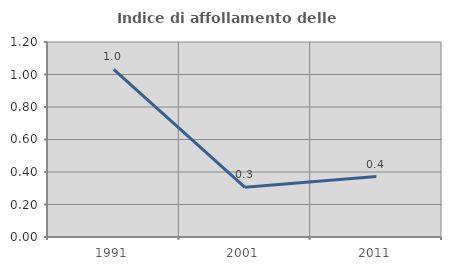
| Category | Indice di affollamento delle abitazioni  |
|---|---|
| 1991.0 | 1.032 |
| 2001.0 | 0.306 |
| 2011.0 | 0.372 |